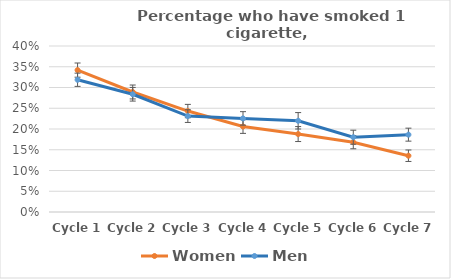
| Category | Women | Men |
|---|---|---|
| Cycle 1 | 0.342 | 0.319 |
| Cycle 2 | 0.289 | 0.284 |
| Cycle 3 | 0.243 | 0.231 |
| Cycle 4 | 0.206 | 0.226 |
| Cycle 5 | 0.188 | 0.22 |
| Cycle 6 | 0.168 | 0.18 |
| Cycle 7 | 0.136 | 0.186 |